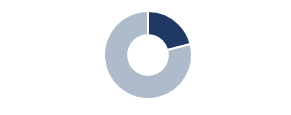
| Category | Series 0 |
|---|---|
| 0 | 0.21 |
| 1 | 0.79 |